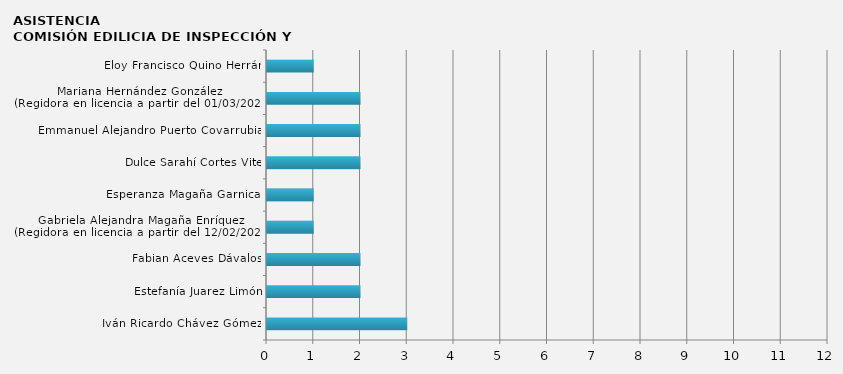
| Category | Iván Ricardo Chávez Gómez  |
|---|---|
| Iván Ricardo Chávez Gómez  | 3 |
| Estefanía Juarez Limón | 2 |
| Fabian Aceves Dávalos | 2 |
| Gabriela Alejandra Magaña Enríquez
(Regidora en licencia a partir del 12/02/2024) | 1 |
| Esperanza Magaña Garnica  | 1 |
| Dulce Sarahí Cortes Vite | 2 |
| Emmanuel Alejandro Puerto Covarrubias | 2 |
| Mariana Hernández González
(Regidora en licencia a partir del 01/03/2024) | 2 |
| Eloy Francisco Quino Herrán | 1 |